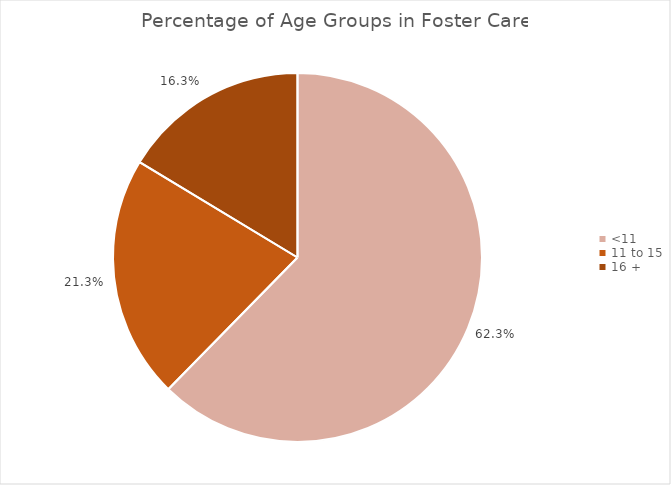
| Category | Series 0 |
|---|---|
| <11 | 0.623 |
| 11 to 15 | 0.213 |
| 16 + | 0.163 |